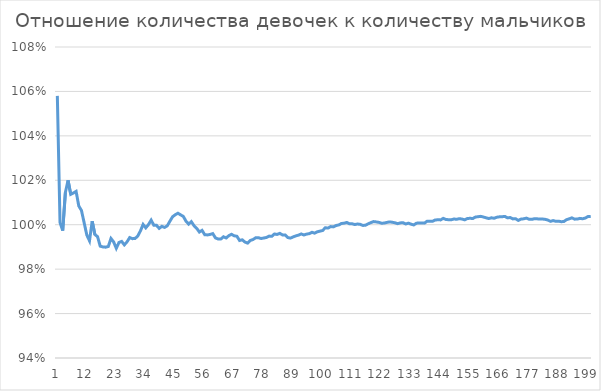
| Category | Series 0 |
|---|---|
| 0 | 1.058 |
| 1 | 1.001 |
| 2 | 0.997 |
| 3 | 1.014 |
| 4 | 1.02 |
| 5 | 1.014 |
| 6 | 1.014 |
| 7 | 1.015 |
| 8 | 1.008 |
| 9 | 1.006 |
| 10 | 1.001 |
| 11 | 0.995 |
| 12 | 0.993 |
| 13 | 1.002 |
| 14 | 0.996 |
| 15 | 0.995 |
| 16 | 0.99 |
| 17 | 0.99 |
| 18 | 0.99 |
| 19 | 0.99 |
| 20 | 0.994 |
| 21 | 0.992 |
| 22 | 0.989 |
| 23 | 0.992 |
| 24 | 0.992 |
| 25 | 0.991 |
| 26 | 0.992 |
| 27 | 0.994 |
| 28 | 0.994 |
| 29 | 0.994 |
| 30 | 0.995 |
| 31 | 0.997 |
| 32 | 1 |
| 33 | 0.999 |
| 34 | 1 |
| 35 | 1.002 |
| 36 | 1 |
| 37 | 1 |
| 38 | 0.998 |
| 39 | 0.999 |
| 40 | 0.999 |
| 41 | 0.999 |
| 42 | 1.002 |
| 43 | 1.004 |
| 44 | 1.004 |
| 45 | 1.005 |
| 46 | 1.004 |
| 47 | 1.004 |
| 48 | 1.002 |
| 49 | 1 |
| 50 | 1.001 |
| 51 | 1 |
| 52 | 0.998 |
| 53 | 0.997 |
| 54 | 0.997 |
| 55 | 0.995 |
| 56 | 0.995 |
| 57 | 0.996 |
| 58 | 0.996 |
| 59 | 0.994 |
| 60 | 0.994 |
| 61 | 0.994 |
| 62 | 0.995 |
| 63 | 0.994 |
| 64 | 0.995 |
| 65 | 0.996 |
| 66 | 0.995 |
| 67 | 0.995 |
| 68 | 0.993 |
| 69 | 0.993 |
| 70 | 0.992 |
| 71 | 0.992 |
| 72 | 0.993 |
| 73 | 0.993 |
| 74 | 0.994 |
| 75 | 0.994 |
| 76 | 0.994 |
| 77 | 0.994 |
| 78 | 0.994 |
| 79 | 0.995 |
| 80 | 0.995 |
| 81 | 0.996 |
| 82 | 0.996 |
| 83 | 0.996 |
| 84 | 0.995 |
| 85 | 0.995 |
| 86 | 0.994 |
| 87 | 0.994 |
| 88 | 0.995 |
| 89 | 0.995 |
| 90 | 0.995 |
| 91 | 0.996 |
| 92 | 0.995 |
| 93 | 0.996 |
| 94 | 0.996 |
| 95 | 0.997 |
| 96 | 0.996 |
| 97 | 0.997 |
| 98 | 0.997 |
| 99 | 0.997 |
| 100 | 0.999 |
| 101 | 0.998 |
| 102 | 0.999 |
| 103 | 0.999 |
| 104 | 1 |
| 105 | 1 |
| 106 | 1.001 |
| 107 | 1.001 |
| 108 | 1.001 |
| 109 | 1 |
| 110 | 1 |
| 111 | 1 |
| 112 | 1 |
| 113 | 1 |
| 114 | 1 |
| 115 | 1 |
| 116 | 1 |
| 117 | 1.001 |
| 118 | 1.001 |
| 119 | 1.001 |
| 120 | 1.001 |
| 121 | 1.001 |
| 122 | 1.001 |
| 123 | 1.001 |
| 124 | 1.001 |
| 125 | 1.001 |
| 126 | 1.001 |
| 127 | 1 |
| 128 | 1.001 |
| 129 | 1.001 |
| 130 | 1 |
| 131 | 1.001 |
| 132 | 1 |
| 133 | 1 |
| 134 | 1.001 |
| 135 | 1.001 |
| 136 | 1.001 |
| 137 | 1.001 |
| 138 | 1.002 |
| 139 | 1.002 |
| 140 | 1.002 |
| 141 | 1.002 |
| 142 | 1.002 |
| 143 | 1.002 |
| 144 | 1.003 |
| 145 | 1.002 |
| 146 | 1.002 |
| 147 | 1.002 |
| 148 | 1.003 |
| 149 | 1.002 |
| 150 | 1.003 |
| 151 | 1.003 |
| 152 | 1.002 |
| 153 | 1.003 |
| 154 | 1.003 |
| 155 | 1.003 |
| 156 | 1.003 |
| 157 | 1.004 |
| 158 | 1.004 |
| 159 | 1.003 |
| 160 | 1.003 |
| 161 | 1.003 |
| 162 | 1.003 |
| 163 | 1.003 |
| 164 | 1.003 |
| 165 | 1.004 |
| 166 | 1.004 |
| 167 | 1.004 |
| 168 | 1.003 |
| 169 | 1.003 |
| 170 | 1.003 |
| 171 | 1.003 |
| 172 | 1.002 |
| 173 | 1.003 |
| 174 | 1.003 |
| 175 | 1.003 |
| 176 | 1.002 |
| 177 | 1.002 |
| 178 | 1.003 |
| 179 | 1.003 |
| 180 | 1.003 |
| 181 | 1.003 |
| 182 | 1.002 |
| 183 | 1.002 |
| 184 | 1.002 |
| 185 | 1.002 |
| 186 | 1.002 |
| 187 | 1.002 |
| 188 | 1.001 |
| 189 | 1.001 |
| 190 | 1.002 |
| 191 | 1.003 |
| 192 | 1.003 |
| 193 | 1.003 |
| 194 | 1.003 |
| 195 | 1.003 |
| 196 | 1.003 |
| 197 | 1.003 |
| 198 | 1.004 |
| 199 | 1.004 |